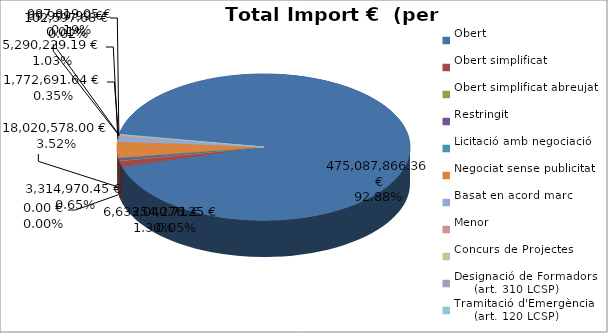
| Category | Total preu
(amb IVA) |
|---|---|
| Obert | 475087866.363 |
| Obert simplificat | 6633040.714 |
| Obert simplificat abreujat | 254276.249 |
| Restringit | 3314970.45 |
| Licitació amb negociació | 0 |
| Negociat sense publicitat | 18020578.001 |
| Basat en acord marc | 5290229.192 |
| Menor | 1772691.637 |
| Concurs de Projectes | 69999.988 |
| Designació de Formadors
     (art. 310 LCSP) | 102597.679 |
| Tramitació d'Emergència
     (art. 120 LCSP) | 987819.05 |